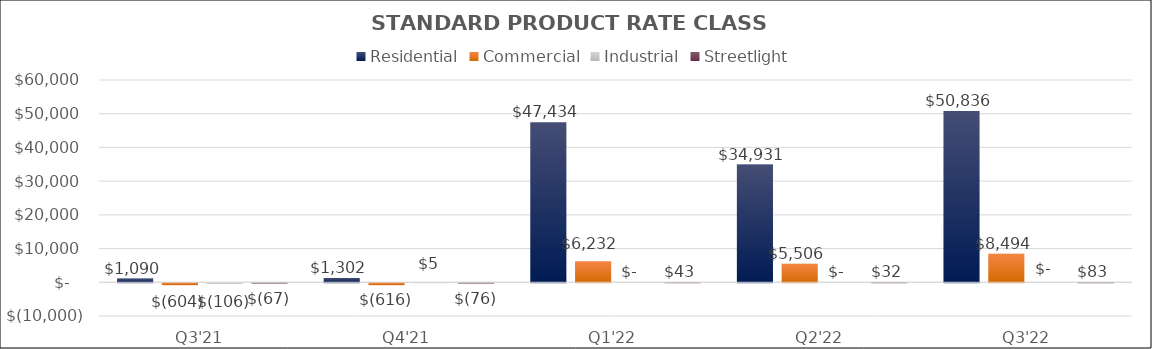
| Category | Residential | Commercial | Industrial | Streetlight |
|---|---|---|---|---|
| Q3'21 | 1089.763 | -604.482 | -105.976 | -66.77 |
| Q4'21 | 1302.024 | -615.876 | 5.28 | -76.121 |
| Q1'22 | 47433.831 | 6232.078 | 0 | 43.006 |
| Q2'22 | 34930.937 | 5506.476 | 0 | 31.67 |
| Q3'22 | 50835.505 | 8494.17 | 0 | 83.495 |